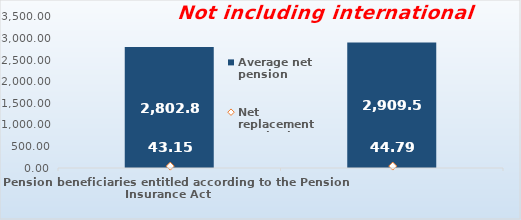
| Category | Average net pension  |
|---|---|
| Pension beneficiaries entitled according to the Pension Insurance Act   | 2802.86 |
| Pension beneficiaries entitled to pension FOR THE FIRST TIME in 2019 according to the Pension Insurance Act  - NEW BENEFICIARIES | 2909.518 |